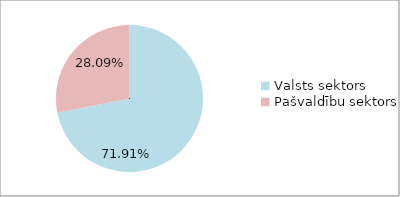
| Category | Series 0 |
|---|---|
| Valsts sektors | 0.719 |
| Pašvaldību sektors | 0.281 |